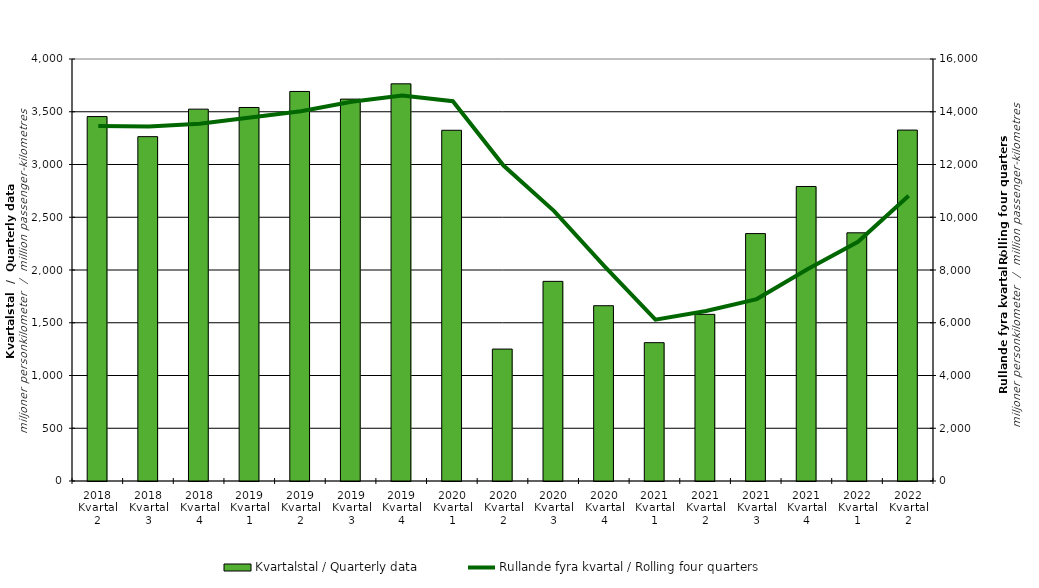
| Category | Kvartalstal / Quarterly data |
|---|---|
| 2018 Kvartal 2 | 3454.255 |
| 2018 Kvartal 3 | 3264.066 |
| 2018 Kvartal 4 | 3524.594 |
| 2019 Kvartal 1 | 3540.48 |
| 2019 Kvartal 2 | 3692.248 |
| 2019 Kvartal 3 | 3619.721 |
| 2019 Kvartal 4 | 3764.759 |
| 2020 Kvartal 1 | 3324.383 |
| 2020 Kvartal 2 | 1250.488 |
| 2020 Kvartal 3 | 1892.351 |
| 2020 Kvartal 4 | 1661.523 |
| 2021 Kvartal 1 | 1311.197 |
| 2021 Kvartal 2 | 1579.614 |
| 2021 Kvartal 3 | 2345.169 |
| 2021 Kvartal 4 | 2791.509 |
| 2022 Kvartal 1 | 2352.564 |
| 2022 Kvartal 2 | 3326.183 |